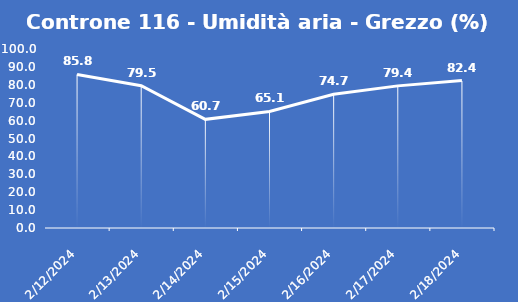
| Category | Controne 116 - Umidità aria - Grezzo (%) |
|---|---|
| 2/12/24 | 85.8 |
| 2/13/24 | 79.5 |
| 2/14/24 | 60.7 |
| 2/15/24 | 65.1 |
| 2/16/24 | 74.7 |
| 2/17/24 | 79.4 |
| 2/18/24 | 82.4 |